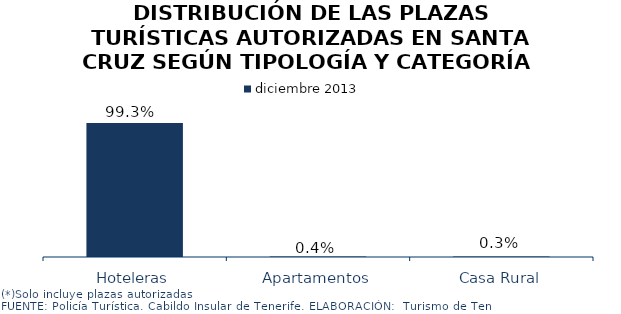
| Category | diciembre 2013 |
|---|---|
| Hoteleras | 0.993 |
| Apartamentos | 0.004 |
| Casa Rural | 0.003 |